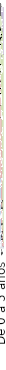
| Category | De 18 a 29 años de edad | De 30 a 44 años de edad | De 45 a 64 años de edad | De 65 años de edad a más |
|---|---|---|---|---|
| De 0 a 5 años | 0.293 | 0.429 | 0.255 | 0.023 |
| De 6 a 10 años | 0.076 | 0.484 | 0.406 | 0.035 |
| De 11 a 20 años | 0.008 | 0.399 | 0.538 | 0.055 |
| De 21 a 30 años | 0.009 | 0.071 | 0.819 | 0.101 |
| De 31 años a más | 0.008 | 0.017 | 0.78 | 0.195 |